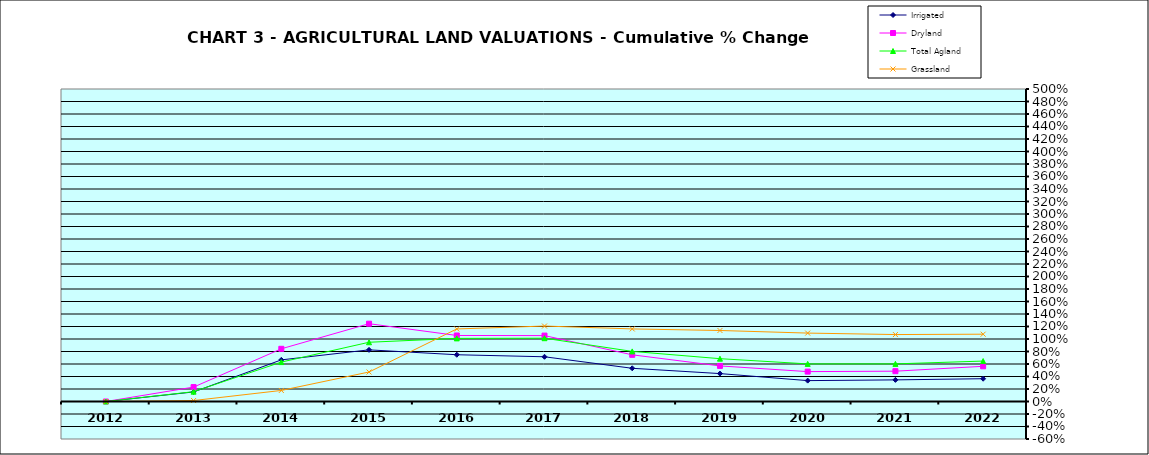
| Category | Irrigated | Dryland | Total Agland | Grassland |
|---|---|---|---|---|
| 2012.0 | 0 | 0 | 0 | 0 |
| 2013.0 | 0.153 | 0.231 | 0.157 | 0.015 |
| 2014.0 | 0.666 | 0.843 | 0.631 | 0.177 |
| 2015.0 | 0.826 | 1.245 | 0.948 | 0.472 |
| 2016.0 | 0.748 | 1.056 | 1.01 | 1.161 |
| 2017.0 | 0.716 | 1.054 | 1.013 | 1.207 |
| 2018.0 | 0.531 | 0.747 | 0.802 | 1.161 |
| 2019.0 | 0.447 | 0.569 | 0.685 | 1.136 |
| 2020.0 | 0.334 | 0.478 | 0.602 | 1.095 |
| 2021.0 | 0.346 | 0.485 | 0.602 | 1.071 |
| 2022.0 | 0.365 | 0.563 | 0.647 | 1.077 |